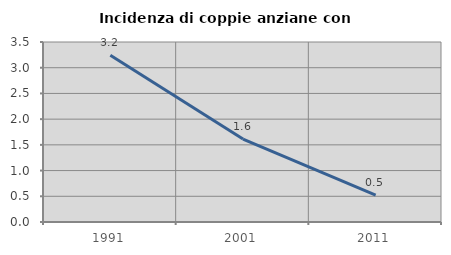
| Category | Incidenza di coppie anziane con figli |
|---|---|
| 1991.0 | 3.243 |
| 2001.0 | 1.613 |
| 2011.0 | 0.524 |